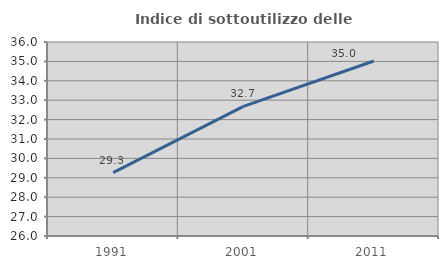
| Category | Indice di sottoutilizzo delle abitazioni  |
|---|---|
| 1991.0 | 29.268 |
| 2001.0 | 32.682 |
| 2011.0 | 35.021 |